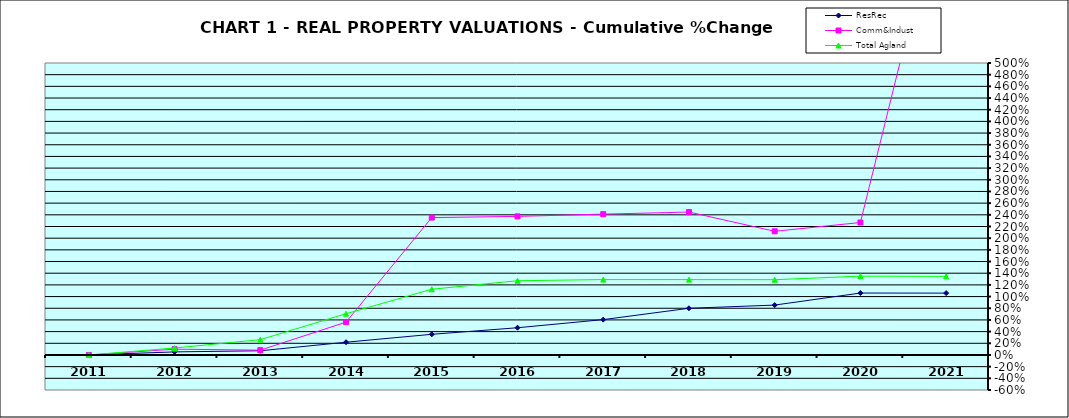
| Category | ResRec | Comm&Indust | Total Agland |
|---|---|---|---|
| 2011.0 | 0 | 0 | 0 |
| 2012.0 | 0.053 | 0.099 | 0.119 |
| 2013.0 | 0.072 | 0.083 | 0.262 |
| 2014.0 | 0.218 | 0.562 | 0.706 |
| 2015.0 | 0.354 | 2.353 | 1.125 |
| 2016.0 | 0.466 | 2.373 | 1.271 |
| 2017.0 | 0.605 | 2.412 | 1.291 |
| 2018.0 | 0.799 | 2.447 | 1.29 |
| 2019.0 | 0.854 | 2.118 | 1.289 |
| 2020.0 | 1.06 | 2.268 | 1.35 |
| 2021.0 | 1.059 | 8.199 | 1.346 |